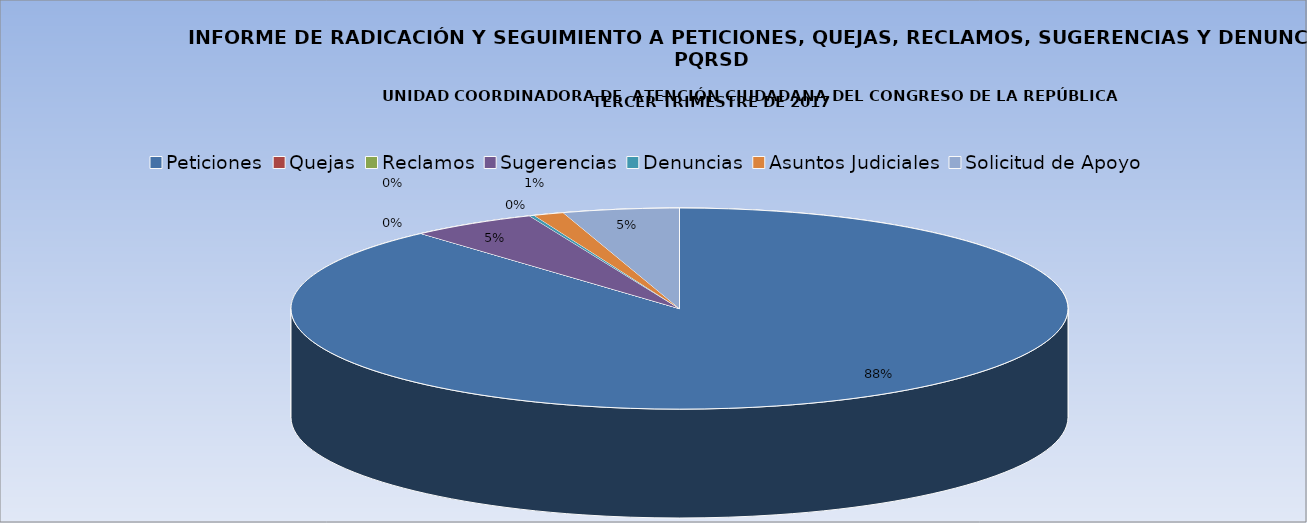
| Category | JUL 2017 | AGOS 2017 | SEPT 2017 |
|---|---|---|---|
| Peticiones | 420 | 474 | 455 |
| Quejas | 0 | 5 | 0 |
| Reclamos | 0 | 0 | 0 |
| Sugerencias | 25 | 29 | 16 |
| Denuncias | 1 | 0 | 1 |
| Asuntos Judiciales | 6 | 4 | 3 |
| Solicitud de Apoyo | 23 | 89 | 49 |